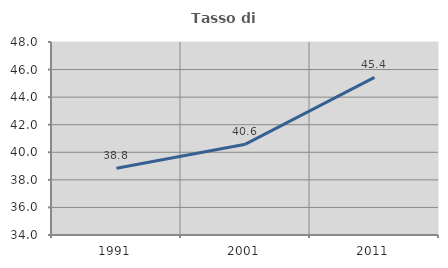
| Category | Tasso di occupazione   |
|---|---|
| 1991.0 | 38.844 |
| 2001.0 | 40.588 |
| 2011.0 | 45.438 |